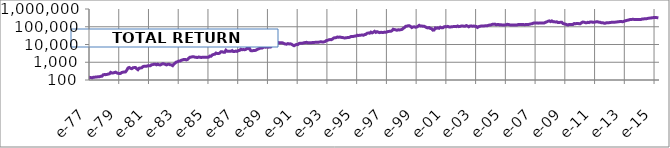
| Category | TOTAL RETURN BERKSHIRE |
|---|---|
| 1976-10-14 | 100 |
| 1976-11-14 | 98.51 |
| 1976-12-14 | 119.4 |
| 1977-01-14 | 140.3 |
| 1977-02-14 | 137.31 |
| 1977-03-14 | 131.34 |
| 1977-04-14 | 141.79 |
| 1977-05-14 | 141.79 |
| 1977-06-14 | 149.25 |
| 1977-07-14 | 149.25 |
| 1977-08-14 | 152.24 |
| 1977-09-14 | 153.73 |
| 1977-10-14 | 161.19 |
| 1977-11-14 | 164.18 |
| 1977-12-14 | 197.01 |
| 1978-01-14 | 202.99 |
| 1978-02-14 | 200 |
| 1978-03-14 | 205.97 |
| 1978-04-14 | 216.42 |
| 1978-05-14 | 223.88 |
| 1978-06-14 | 268.66 |
| 1978-07-14 | 246.27 |
| 1978-08-14 | 250.75 |
| 1978-09-14 | 261.19 |
| 1978-10-14 | 276.12 |
| 1978-11-14 | 250.75 |
| 1978-12-14 | 238.81 |
| 1979-01-14 | 232.84 |
| 1979-02-14 | 235.82 |
| 1979-03-14 | 265.67 |
| 1979-04-14 | 276.12 |
| 1979-05-14 | 283.58 |
| 1979-06-14 | 286.57 |
| 1979-07-14 | 358.21 |
| 1979-08-14 | 477.61 |
| 1979-09-14 | 507.46 |
| 1979-10-14 | 455.22 |
| 1979-11-14 | 432.84 |
| 1979-12-14 | 492.54 |
| 1980-01-14 | 500 |
| 1980-02-14 | 507.46 |
| 1980-03-14 | 425.37 |
| 1980-04-14 | 380.6 |
| 1980-05-14 | 462.69 |
| 1980-06-14 | 477.61 |
| 1980-07-14 | 485.07 |
| 1980-08-14 | 567.16 |
| 1980-09-14 | 597.01 |
| 1980-10-14 | 597.01 |
| 1980-11-14 | 597.01 |
| 1980-12-14 | 634.33 |
| 1981-01-14 | 634.33 |
| 1981-02-14 | 634.33 |
| 1981-03-14 | 723.88 |
| 1981-04-14 | 738.81 |
| 1981-05-14 | 783.58 |
| 1981-06-14 | 783.58 |
| 1981-07-14 | 716.42 |
| 1981-08-14 | 776.12 |
| 1981-09-14 | 723.88 |
| 1981-10-14 | 701.49 |
| 1981-11-14 | 768.66 |
| 1981-12-14 | 828.36 |
| 1982-01-14 | 805.97 |
| 1982-02-14 | 761.19 |
| 1982-03-14 | 708.96 |
| 1982-04-14 | 761.19 |
| 1982-05-14 | 776.12 |
| 1982-06-14 | 723.88 |
| 1982-07-14 | 708.96 |
| 1982-08-14 | 641.79 |
| 1982-09-14 | 783.58 |
| 1982-10-14 | 895.52 |
| 1982-11-14 | 1029.85 |
| 1982-12-14 | 1059.7 |
| 1983-01-14 | 1171.64 |
| 1983-02-14 | 1164.18 |
| 1983-03-14 | 1298.51 |
| 1983-04-14 | 1350.75 |
| 1983-05-14 | 1447.76 |
| 1983-06-14 | 1447.76 |
| 1983-07-14 | 1358.21 |
| 1983-08-14 | 1440.3 |
| 1983-09-14 | 1708.96 |
| 1983-10-14 | 1917.91 |
| 1983-11-14 | 1955.22 |
| 1983-12-14 | 2044.78 |
| 1984-01-14 | 2029.85 |
| 1984-02-14 | 1917.91 |
| 1984-03-14 | 1895.52 |
| 1984-04-14 | 1843.28 |
| 1984-05-14 | 1977.61 |
| 1984-06-14 | 1917.91 |
| 1984-07-14 | 1850.75 |
| 1984-08-14 | 1917.91 |
| 1984-09-14 | 1932.84 |
| 1984-10-14 | 1940.3 |
| 1984-11-14 | 1940.3 |
| 1984-12-14 | 1888.06 |
| 1985-01-14 | 1947.76 |
| 1985-02-14 | 2216.42 |
| 1985-03-14 | 2208.96 |
| 1985-04-14 | 2582.09 |
| 1985-05-14 | 2753.73 |
| 1985-06-14 | 2835.82 |
| 1985-07-14 | 3291.04 |
| 1985-08-14 | 3089.55 |
| 1985-09-14 | 3082.09 |
| 1985-10-14 | 3268.66 |
| 1985-11-14 | 3925.37 |
| 1985-12-14 | 3910.45 |
| 1986-01-14 | 3656.72 |
| 1986-02-14 | 3634.33 |
| 1986-03-14 | 4776.12 |
| 1986-04-14 | 4179.1 |
| 1986-05-14 | 4149.25 |
| 1986-06-14 | 4208.95 |
| 1986-07-14 | 4179.1 |
| 1986-08-14 | 4552.24 |
| 1986-09-14 | 3992.54 |
| 1986-10-14 | 4014.93 |
| 1986-11-14 | 4298.5 |
| 1986-12-14 | 4074.63 |
| 1987-01-14 | 4552.24 |
| 1987-02-14 | 4664.18 |
| 1987-03-14 | 5417.91 |
| 1987-04-14 | 5059.7 |
| 1987-05-14 | 5238.8 |
| 1987-06-14 | 5044.77 |
| 1987-07-14 | 5298.5 |
| 1987-08-14 | 6238.8 |
| 1987-09-14 | 5805.97 |
| 1987-10-14 | 6179.1 |
| 1987-11-14 | 4514.92 |
| 1987-12-14 | 4440.3 |
| 1988-01-14 | 4522.39 |
| 1988-02-14 | 4552.24 |
| 1988-03-14 | 4701.49 |
| 1988-04-14 | 5149.25 |
| 1988-05-14 | 5559.7 |
| 1988-06-14 | 5895.52 |
| 1988-07-14 | 6529.85 |
| 1988-08-14 | 6268.66 |
| 1988-09-14 | 6791.04 |
| 1988-10-14 | 7238.8 |
| 1988-11-14 | 7014.92 |
| 1988-12-14 | 7313.43 |
| 1989-01-14 | 7014.92 |
| 1989-02-14 | 7201.49 |
| 1989-03-14 | 7141.79 |
| 1989-04-14 | 8731.34 |
| 1989-05-14 | 8805.97 |
| 1989-06-14 | 9962.68 |
| 1989-07-14 | 10261.19 |
| 1989-08-14 | 11947.76 |
| 1989-09-14 | 12985.07 |
| 1989-10-14 | 12388.06 |
| 1989-11-14 | 12395.52 |
| 1989-12-14 | 12649.25 |
| 1990-01-14 | 12201.49 |
| 1990-02-14 | 11082.09 |
| 1990-03-14 | 10626.86 |
| 1990-04-14 | 10410.45 |
| 1990-05-14 | 11305.97 |
| 1990-06-14 | 10783.58 |
| 1990-07-14 | 10895.52 |
| 1990-08-14 | 10298.5 |
| 1990-09-14 | 9291.04 |
| 1990-10-14 | 8559.7 |
| 1990-11-14 | 9365.67 |
| 1990-12-14 | 10074.63 |
| 1991-01-14 | 9865.67 |
| 1991-02-14 | 11380.59 |
| 1991-03-14 | 11902.98 |
| 1991-04-14 | 11940.3 |
| 1991-05-14 | 11940.3 |
| 1991-06-14 | 12649.25 |
| 1991-07-14 | 12835.82 |
| 1991-08-14 | 13283.58 |
| 1991-09-14 | 12611.94 |
| 1991-10-14 | 12611.94 |
| 1991-11-14 | 12723.88 |
| 1991-12-14 | 12500 |
| 1992-01-14 | 13059.7 |
| 1992-02-14 | 13059.7 |
| 1992-03-14 | 13208.95 |
| 1992-04-14 | 13320.89 |
| 1992-05-14 | 13582.09 |
| 1992-06-14 | 13597.01 |
| 1992-07-14 | 14067.16 |
| 1992-08-14 | 14179.1 |
| 1992-09-14 | 13731.34 |
| 1992-10-14 | 14037.31 |
| 1992-11-14 | 14626.86 |
| 1992-12-14 | 16641.79 |
| 1993-01-14 | 17089.55 |
| 1993-02-14 | 18507.46 |
| 1993-03-14 | 18955.22 |
| 1993-04-14 | 18694.03 |
| 1993-05-14 | 20149.25 |
| 1993-06-14 | 23470.15 |
| 1993-07-14 | 23731.34 |
| 1993-08-14 | 24402.98 |
| 1993-09-14 | 26432.83 |
| 1993-10-14 | 25559.7 |
| 1993-11-14 | 26343.28 |
| 1993-12-14 | 25223.88 |
| 1994-01-14 | 24925.37 |
| 1994-02-14 | 23731.34 |
| 1994-03-14 | 23358.21 |
| 1994-04-14 | 24104.48 |
| 1994-05-14 | 24477.61 |
| 1994-06-14 | 24626.86 |
| 1994-07-14 | 25820.89 |
| 1994-08-14 | 28358.21 |
| 1994-09-14 | 28208.95 |
| 1994-10-14 | 28656.71 |
| 1994-11-14 | 29850.75 |
| 1994-12-14 | 29850.75 |
| 1995-01-14 | 33283.58 |
| 1995-02-14 | 32238.8 |
| 1995-03-14 | 33134.33 |
| 1995-04-14 | 33731.34 |
| 1995-05-14 | 34253.73 |
| 1995-06-14 | 33134.33 |
| 1995-07-14 | 36343.28 |
| 1995-08-14 | 37164.18 |
| 1995-09-14 | 43283.58 |
| 1995-10-14 | 44253.73 |
| 1995-11-14 | 43283.58 |
| 1995-12-14 | 49701.49 |
| 1996-01-14 | 45074.63 |
| 1996-02-14 | 49253.73 |
| 1996-03-14 | 55373.13 |
| 1996-04-14 | 48059.7 |
| 1996-05-14 | 52686.57 |
| 1996-06-14 | 49402.98 |
| 1996-07-14 | 46679.1 |
| 1996-08-14 | 48507.46 |
| 1996-09-14 | 47985.07 |
| 1996-10-14 | 47611.94 |
| 1996-11-14 | 49850.75 |
| 1996-12-14 | 49253.73 |
| 1997-01-14 | 51194.03 |
| 1997-02-14 | 54328.36 |
| 1997-03-14 | 55074.63 |
| 1997-04-14 | 55373.13 |
| 1997-05-14 | 59552.24 |
| 1997-06-14 | 72537.31 |
| 1997-07-14 | 69253.69 |
| 1997-08-14 | 66716.38 |
| 1997-09-14 | 63432.83 |
| 1997-10-14 | 67164.13 |
| 1997-11-14 | 66268.63 |
| 1997-12-14 | 68208.94 |
| 1998-01-14 | 69999.94 |
| 1998-02-14 | 80447.75 |
| 1998-03-14 | 88507.44 |
| 1998-04-14 | 105223.9 |
| 1998-05-14 | 107611.9 |
| 1998-06-14 | 113432.8 |
| 1998-07-14 | 114925.3 |
| 1998-08-14 | 104044.8 |
| 1998-09-14 | 89850.69 |
| 1998-10-14 | 97910.44 |
| 1998-11-14 | 99104.44 |
| 1998-12-14 | 93731.31 |
| 1999-01-14 | 96417.88 |
| 1999-02-14 | 106119.4 |
| 1999-03-14 | 119850.7 |
| 1999-04-14 | 108955.2 |
| 1999-05-14 | 110895.5 |
| 1999-06-14 | 105671.6 |
| 1999-07-14 | 106567.1 |
| 1999-08-14 | 98656.69 |
| 1999-09-14 | 89253.69 |
| 1999-10-14 | 85820.88 |
| 1999-11-14 | 89999.94 |
| 1999-12-14 | 79701.44 |
| 2000-01-14 | 77910.44 |
| 2000-02-14 | 64328.36 |
| 2000-03-14 | 65671.63 |
| 2000-04-14 | 86567.13 |
| 2000-05-14 | 82089.5 |
| 2000-06-14 | 87611.94 |
| 2000-07-14 | 81940.25 |
| 2000-08-14 | 94328.31 |
| 2000-09-14 | 86716.38 |
| 2000-10-14 | 86567.13 |
| 2000-11-14 | 98805.94 |
| 2000-12-14 | 102388 |
| 2001-01-14 | 98805.94 |
| 2001-02-14 | 104925.3 |
| 2001-03-14 | 98358.19 |
| 2001-04-14 | 95671.63 |
| 2001-05-14 | 100298.5 |
| 2001-06-14 | 101044.8 |
| 2001-07-14 | 103134.3 |
| 2001-08-14 | 103134.3 |
| 2001-09-14 | 101492.5 |
| 2001-10-14 | 110298.5 |
| 2001-11-14 | 101492.5 |
| 2001-12-14 | 104402.9 |
| 2002-01-14 | 110298.5 |
| 2002-02-14 | 109850.7 |
| 2002-03-14 | 107462.6 |
| 2002-04-14 | 105970.1 |
| 2002-05-14 | 116417.9 |
| 2002-06-14 | 108955.2 |
| 2002-07-14 | 99402.94 |
| 2002-08-14 | 109552.2 |
| 2002-09-14 | 111940.3 |
| 2002-10-14 | 105835.8 |
| 2002-11-14 | 109850.7 |
| 2002-12-14 | 106268.6 |
| 2003-01-14 | 104029.8 |
| 2003-02-14 | 91343.25 |
| 2003-03-14 | 101641.8 |
| 2003-04-14 | 105955.2 |
| 2003-05-14 | 109850.7 |
| 2003-06-14 | 109402.9 |
| 2003-07-14 | 110447.8 |
| 2003-08-14 | 112388 |
| 2003-09-14 | 113134.3 |
| 2003-10-14 | 114328.3 |
| 2003-11-14 | 122074.6 |
| 2003-12-14 | 124776.1 |
| 2004-01-14 | 128365.6 |
| 2004-02-14 | 137164.1 |
| 2004-03-14 | 137537.3 |
| 2004-04-14 | 140597 |
| 2004-05-14 | 129104.4 |
| 2004-06-14 | 132985.1 |
| 2004-07-14 | 134925.3 |
| 2004-08-14 | 127014.9 |
| 2004-09-14 | 128805.9 |
| 2004-10-14 | 125970.1 |
| 2004-11-14 | 124328.3 |
| 2004-12-14 | 127014.9 |
| 2005-01-14 | 128134.3 |
| 2005-02-14 | 136537.3 |
| 2005-03-14 | 135223.9 |
| 2005-04-14 | 128358.2 |
| 2005-05-14 | 123880.6 |
| 2005-06-14 | 125970.1 |
| 2005-07-14 | 124925.3 |
| 2005-08-14 | 125671.6 |
| 2005-09-14 | 124029.8 |
| 2005-10-14 | 126268.6 |
| 2005-11-14 | 134537.3 |
| 2005-12-14 | 133134.4 |
| 2006-01-14 | 133731.3 |
| 2006-02-14 | 131492.5 |
| 2006-03-14 | 133955.2 |
| 2006-04-14 | 129402.9 |
| 2006-05-14 | 133586.6 |
| 2006-06-14 | 134477.6 |
| 2006-07-14 | 134029.8 |
| 2006-08-14 | 138335.8 |
| 2006-09-14 | 144626.8 |
| 2006-10-14 | 147164.1 |
| 2006-11-14 | 158917.9 |
| 2006-12-14 | 164328.3 |
| 2007-01-14 | 164179.1 |
| 2007-02-14 | 161940.3 |
| 2007-03-14 | 159402.9 |
| 2007-04-14 | 164029.8 |
| 2007-05-14 | 163208.9 |
| 2007-06-14 | 163134.3 |
| 2007-07-14 | 165238.8 |
| 2007-08-14 | 164402.9 |
| 2007-09-14 | 179104.4 |
| 2007-10-14 | 189701.4 |
| 2007-11-14 | 205223.9 |
| 2007-12-14 | 213432.8 |
| 2008-01-14 | 194641.8 |
| 2008-02-14 | 213417.9 |
| 2008-03-14 | 193074.6 |
| 2008-04-14 | 191813.4 |
| 2008-05-14 | 184328.3 |
| 2008-06-14 | 189552.2 |
| 2008-07-14 | 173134.3 |
| 2008-08-14 | 173432.8 |
| 2008-09-14 | 178358.2 |
| 2008-10-14 | 177388 |
| 2008-11-14 | 150746.3 |
| 2008-12-14 | 146850.7 |
| 2009-01-14 | 139029.8 |
| 2009-02-14 | 131552.2 |
| 2009-03-14 | 124701.4 |
| 2009-04-14 | 135373.1 |
| 2009-05-14 | 133731.3 |
| 2009-06-14 | 135626.8 |
| 2009-07-14 | 133432.8 |
| 2009-08-14 | 151343.3 |
| 2009-09-14 | 147388 |
| 2009-10-14 | 152238.8 |
| 2009-11-14 | 152320.9 |
| 2009-12-14 | 148358.2 |
| 2010-01-14 | 147761.2 |
| 2010-02-14 | 170149.3 |
| 2010-03-14 | 183880.6 |
| 2010-04-14 | 180746.3 |
| 2010-05-14 | 170373.1 |
| 2010-06-14 | 167462.6 |
| 2010-07-14 | 177641.8 |
| 2010-08-14 | 171910.4 |
| 2010-09-14 | 185835.8 |
| 2010-10-14 | 187480.6 |
| 2010-11-14 | 179628.3 |
| 2010-12-14 | 179402.9 |
| 2011-01-14 | 182798.5 |
| 2011-02-14 | 190820.9 |
| 2011-03-14 | 188656.7 |
| 2011-04-14 | 180965.6 |
| 2011-05-14 | 178347.8 |
| 2011-06-14 | 168211.9 |
| 2011-07-14 | 170298.5 |
| 2011-08-14 | 160597 |
| 2011-09-14 | 155820.9 |
| 2011-10-14 | 167462.6 |
| 2011-11-14 | 170031.3 |
| 2011-12-14 | 168955.2 |
| 2012-01-14 | 173910.4 |
| 2012-02-14 | 176828.3 |
| 2012-03-14 | 180707.4 |
| 2012-04-14 | 176694 |
| 2012-05-14 | 181604.4 |
| 2012-06-14 | 182985.1 |
| 2012-07-14 | 188992.5 |
| 2012-08-14 | 190111.9 |
| 2012-09-14 | 198507.4 |
| 2012-10-14 | 197764.1 |
| 2012-11-14 | 191268.6 |
| 2012-12-14 | 199694 |
| 2013-01-14 | 213432.8 |
| 2013-02-14 | 222746.3 |
| 2013-03-14 | 232820.9 |
| 2013-04-14 | 239589.5 |
| 2013-05-14 | 252637.3 |
| 2013-06-14 | 255610.4 |
| 2013-07-14 | 261947.8 |
| 2013-08-14 | 260828.3 |
| 2013-09-14 | 253962.6 |
| 2013-10-14 | 259999.9 |
| 2013-11-14 | 258686.6 |
| 2013-12-14 | 255373.1 |
| 2014-01-14 | 257089.5 |
| 2014-02-14 | 257350.7 |
| 2014-03-14 | 274417.9 |
| 2014-04-14 | 273450.7 |
| 2014-05-14 | 285701.4 |
| 2014-06-14 | 282865.6 |
| 2014-07-14 | 288626.8 |
| 2014-08-14 | 302761.2 |
| 2014-09-14 | 306917.9 |
| 2014-10-14 | 307499.9 |
| 2014-11-14 | 325407.4 |
| 2014-12-14 | 326865.6 |
| 2015-01-14 | 331161.2 |
| 2015-02-14 | 332171.6 |
| 2015-03-14 | 324056.6 |
| 2015-04-14 | 320029.8 |